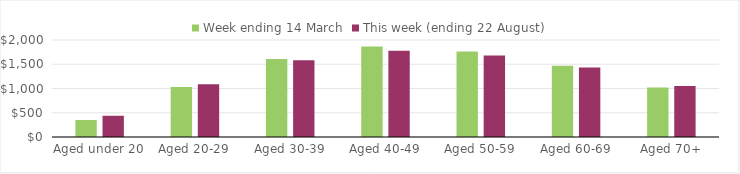
| Category | Week ending 14 March | This week (ending 22 August) |
|---|---|---|
| Aged under 20 | 351.12 | 437.92 |
| Aged 20-29 | 1029.29 | 1088.4 |
| Aged 30-39 | 1610.15 | 1580.95 |
| Aged 40-49 | 1865.49 | 1777.91 |
| Aged 50-59 | 1761.52 | 1681.13 |
| Aged 60-69 | 1468.14 | 1434.86 |
| Aged 70+ | 1018.71 | 1051.84 |